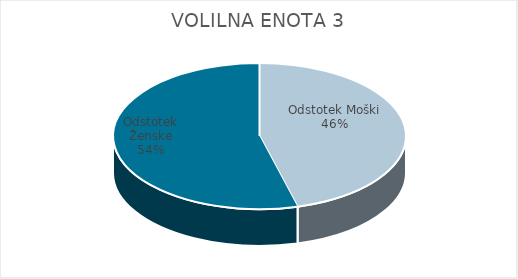
| Category | VOLILNA ENOTA 3 | #REF! | Slovenija skupaj |
|---|---|---|---|
| Odstotek Moški | 23.1 |  | 21.63 |
| Odstotek Ženske | 27.31 |  | 24.53 |